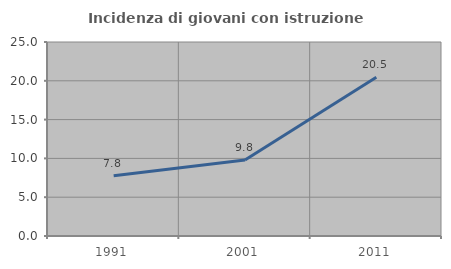
| Category | Incidenza di giovani con istruzione universitaria |
|---|---|
| 1991.0 | 7.763 |
| 2001.0 | 9.788 |
| 2011.0 | 20.465 |